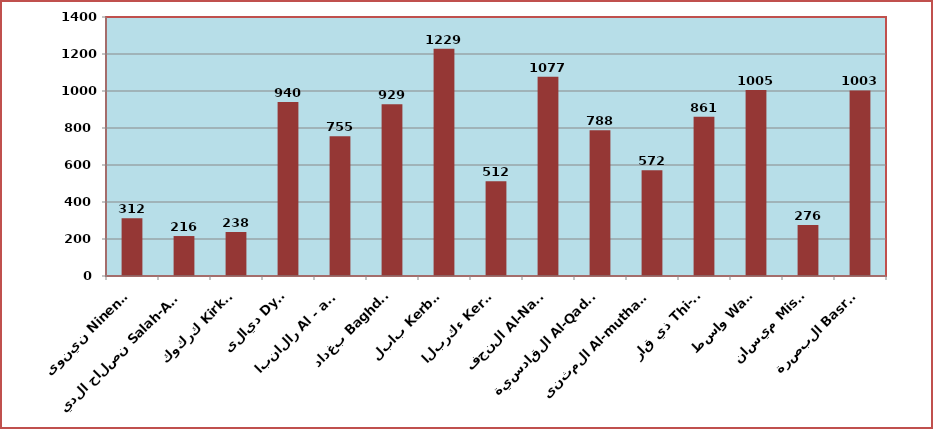
| Category | Series 0 |
|---|---|
| نينوى Ninenwh | 312 |
| صلاح الدين Salah-Aideen | 216 |
| كركوك Kirkuk | 238 |
| ديالى Dyala | 940 |
| الانبار Al - anbar | 755 |
| بغداد Baghdad | 929 |
| بابل Kerbela | 1229 |
| كربلاء Kerbela | 512 |
| النجف Al-Najaf | 1077 |
| القادسية Al-Qadysia | 788 |
| المثنى Al-muthanna | 572 |
| ذي قار Thi-qar | 861 |
| واسط Wasit | 1005 |
| ميسان Missan | 276 |
| البصرة Basrah | 1003 |